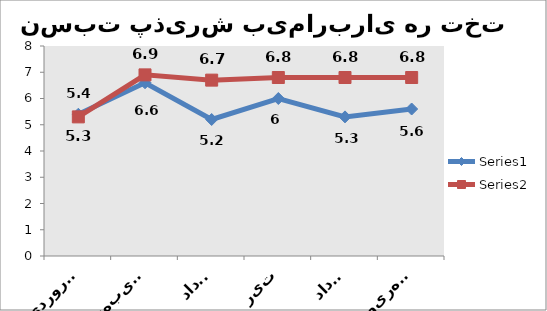
| Category | Series 0 | Series 1 |
|---|---|---|
| فروردین | 5.4 | 5.3 |
| اردیبهشت | 6.6 | 6.9 |
| خرداد | 5.2 | 6.7 |
| تیر | 6 | 6.8 |
| مرداد | 5.3 | 6.8 |
| شهریور | 5.6 | 6.8 |